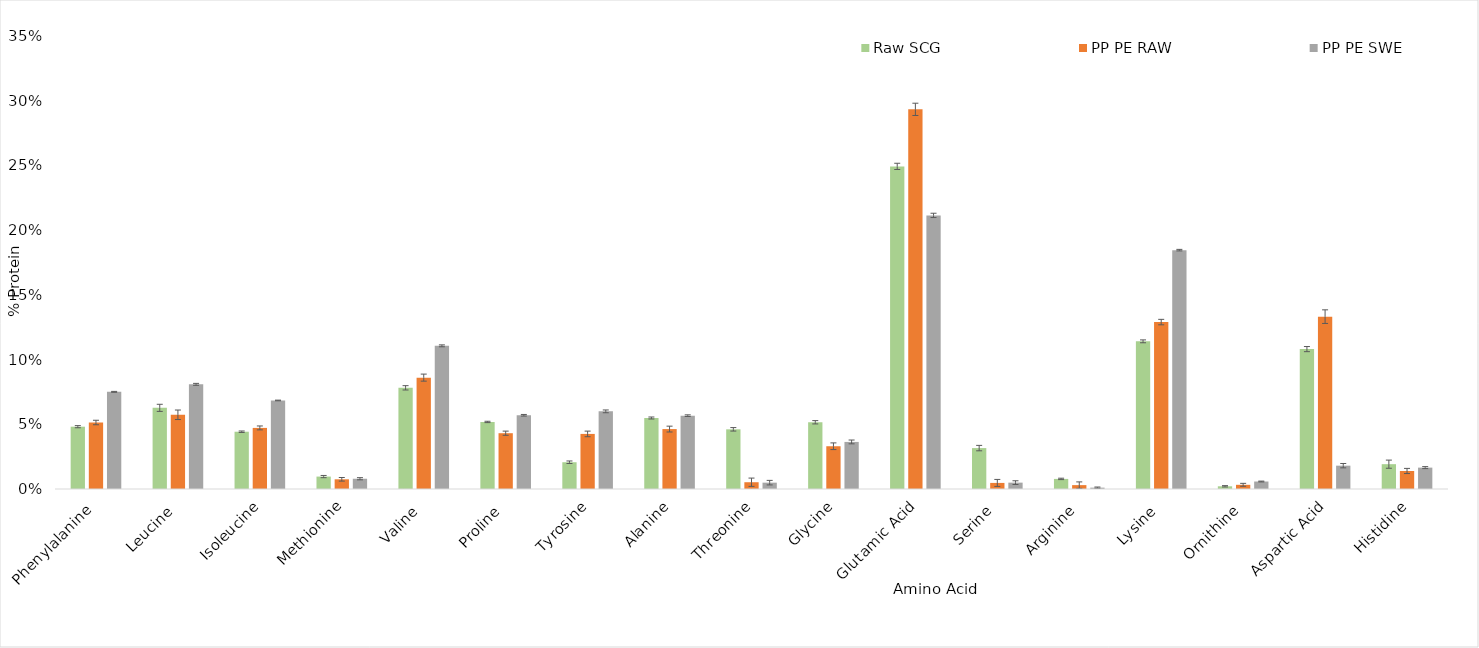
| Category | Raw SCG | PP PE RAW | PP PE SWE |
|---|---|---|---|
| Phenylalanine | 0.048 | 0.051 | 0.075 |
| Leucine | 0.063 | 0.057 | 0.081 |
| Isoleucine | 0.044 | 0.047 | 0.068 |
| Methionine | 0.01 | 0.007 | 0.008 |
| Valine | 0.078 | 0.086 | 0.111 |
| Proline | 0.052 | 0.043 | 0.057 |
| Tyrosine | 0.021 | 0.043 | 0.06 |
| Alanine | 0.055 | 0.046 | 0.057 |
| Threonine | 0.046 | 0.005 | 0.005 |
| Glycine | 0.052 | 0.033 | 0.036 |
| Glutamic Acid | 0.249 | 0.293 | 0.211 |
| Serine | 0.032 | 0.005 | 0.005 |
| Arginine | 0.008 | 0.003 | 0.001 |
| Lysine | 0.114 | 0.129 | 0.185 |
| Ornithine | 0.002 | 0.003 | 0.006 |
| Aspartic Acid | 0.108 | 0.133 | 0.018 |
| Histidine | 0.019 | 0.014 | 0.017 |